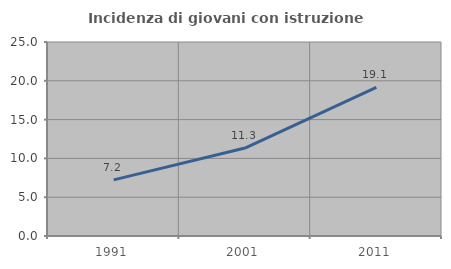
| Category | Incidenza di giovani con istruzione universitaria |
|---|---|
| 1991.0 | 7.229 |
| 2001.0 | 11.333 |
| 2011.0 | 19.149 |